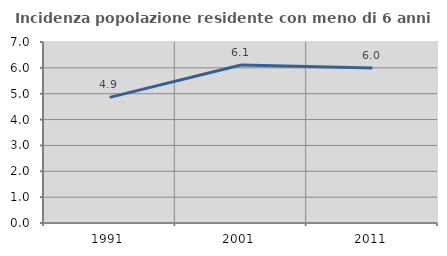
| Category | Incidenza popolazione residente con meno di 6 anni |
|---|---|
| 1991.0 | 4.86 |
| 2001.0 | 6.109 |
| 2011.0 | 5.991 |